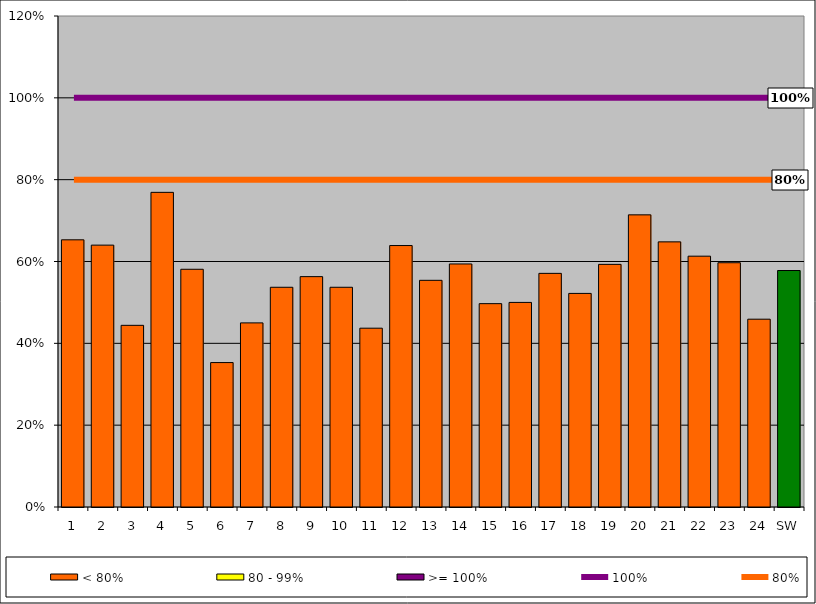
| Category | < 80% | 80 - 99% | >= 100% |
|---|---|---|---|
| 1 | 0.653 | 0 | 0 |
| 2 | 0.64 | 0 | 0 |
| 3 | 0.444 | 0 | 0 |
| 4 | 0.769 | 0 | 0 |
| 5 | 0.581 | 0 | 0 |
| 6 | 0.353 | 0 | 0 |
| 7 | 0.45 | 0 | 0 |
| 8 | 0.537 | 0 | 0 |
| 9 | 0.563 | 0 | 0 |
| 10 | 0.537 | 0 | 0 |
| 11 | 0.437 | 0 | 0 |
| 12 | 0.639 | 0 | 0 |
| 13 | 0.554 | 0 | 0 |
| 14 | 0.594 | 0 | 0 |
| 15 | 0.497 | 0 | 0 |
| 16 | 0.5 | 0 | 0 |
| 17 | 0.571 | 0 | 0 |
| 18 | 0.522 | 0 | 0 |
| 19 | 0.593 | 0 | 0 |
| 20 | 0.714 | 0 | 0 |
| 21 | 0.648 | 0 | 0 |
| 22 | 0.613 | 0 | 0 |
| 23 | 0.597 | 0 | 0 |
| 24 | 0.459 | 0 | 0 |
| SW | 0.578 | 0 | 0 |